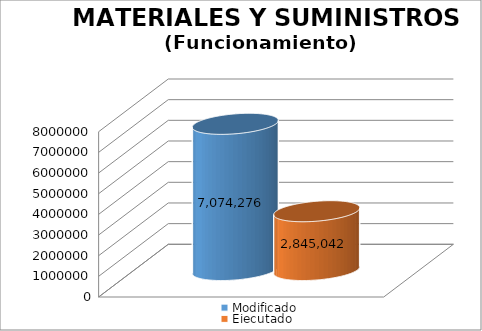
| Category | Modificado | Ejecutado |
|---|---|---|
| 0 | 7074276 | 2845041.97 |